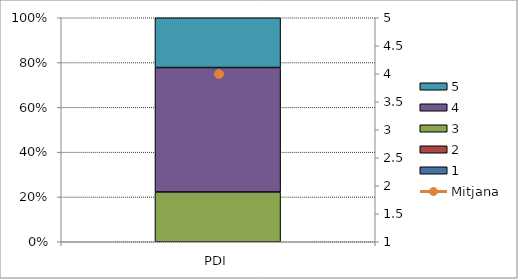
| Category | 1 | 2 | 3 | 4 | 5 |
|---|---|---|---|---|---|
| PDI | 0 | 0 | 2 | 5 | 2 |